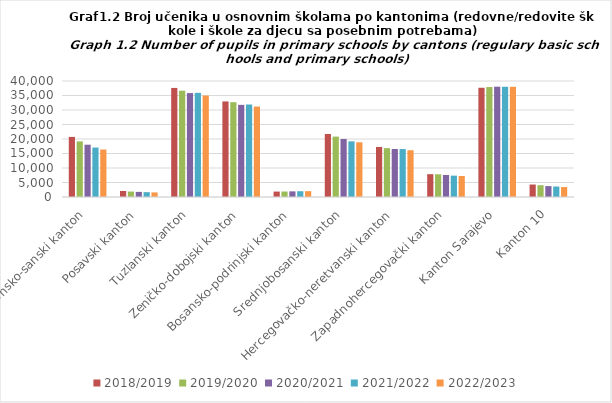
| Category | 2018/2019 | 2019/2020 | 2020/2021 | 2021/2022 | 2022/2023 |
|---|---|---|---|---|---|
| Unsko-sanski kanton | 20716 | 19176 | 18034 | 17049 | 16371 |
| Posavski kanton | 2071 | 1877 | 1762 | 1662 | 1575 |
| Tuzlanski kanton | 37612 | 36655 | 35839 | 35907 | 34977 |
| Zeničko-dobojski kanton | 32952 | 32698 | 31774 | 31895 | 31177 |
| Bosansko-podrinjski kanton | 1871 | 1891 | 1947 | 1995 | 2006 |
| Srednjobosanski kanton | 21729 | 20826 | 20009 | 19185 | 18865 |
| Hercegovačko-neretvanski kanton | 17262 | 16852 | 16555 | 16531 | 16126 |
| Zapadnohercegovački kanton | 7871 | 7830 | 7598 | 7365 | 7243 |
| Kanton Sarajevo | 37669 | 37917 | 38043 | 38014 | 38009 |
| Kanton 10 | 4300 | 4059 | 3755 | 3610 | 3426 |